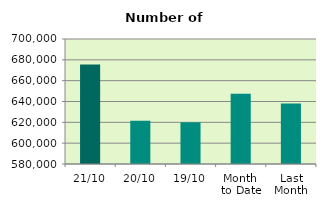
| Category | Series 0 |
|---|---|
| 21/10 | 675620 |
| 20/10 | 621422 |
| 19/10 | 620006 |
| Month 
to Date | 647491.467 |
| Last
Month | 637968.273 |